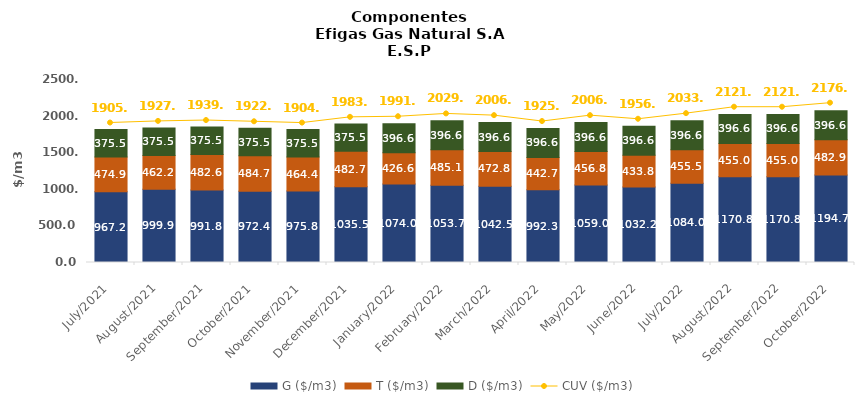
| Category | G ($/m3) | T ($/m3) | D ($/m3) |
|---|---|---|---|
| 2021-07-01 | 967.16 | 474.92 | 375.5 |
| 2021-08-01 | 999.93 | 462.2 | 375.5 |
| 2021-09-01 | 991.84 | 482.61 | 375.5 |
| 2021-10-01 | 972.39 | 484.65 | 375.5 |
| 2021-11-01 | 975.82 | 464.35 | 375.5 |
| 2021-12-01 | 1035.51 | 482.73 | 375.5 |
| 2022-01-01 | 1074.01 | 426.57 | 396.6 |
| 2022-02-01 | 1053.67 | 485.05 | 396.6 |
| 2022-03-01 | 1042.54 | 472.76 | 396.6 |
| 2022-04-01 | 992.34 | 442.65 | 396.6 |
| 2022-05-01 | 1058.95 | 456.78 | 396.6 |
| 2022-06-01 | 1032.15 | 433.82 | 396.6 |
| 2022-07-01 | 1084.04 | 455.47 | 396.6 |
| 2022-08-01 | 1170.84 | 455.02 | 396.6 |
| 2022-09-01 | 1170.84 | 455.02 | 396.6 |
| 2022-10-01 | 1194.65 | 482.93 | 396.6 |